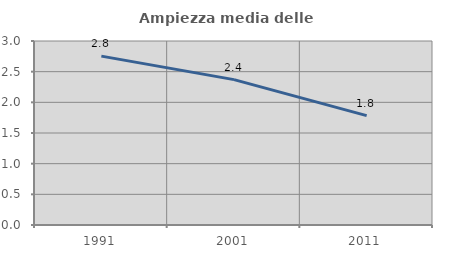
| Category | Ampiezza media delle famiglie |
|---|---|
| 1991.0 | 2.753 |
| 2001.0 | 2.371 |
| 2011.0 | 1.783 |